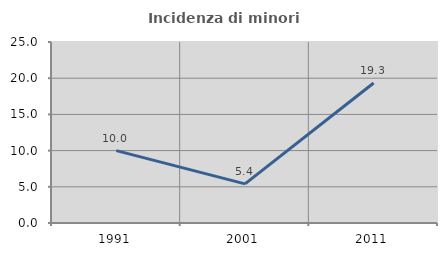
| Category | Incidenza di minori stranieri |
|---|---|
| 1991.0 | 10 |
| 2001.0 | 5.405 |
| 2011.0 | 19.332 |